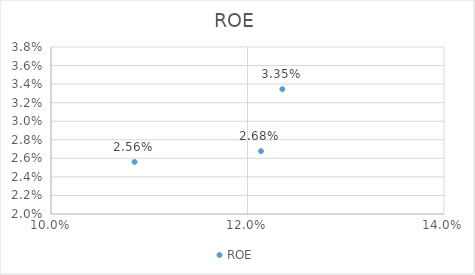
| Category | ROE |
|---|---|
| 0.10850538888888889 | 0.026 |
| 0.12136987037037038 | 0.027 |
| 0.12354627777777777 | 0.033 |